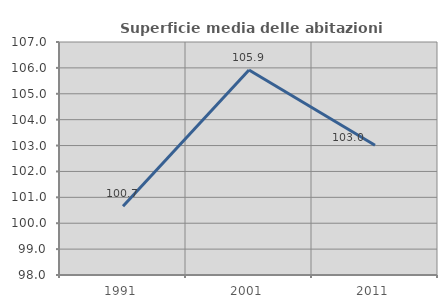
| Category | Superficie media delle abitazioni occupate |
|---|---|
| 1991.0 | 100.653 |
| 2001.0 | 105.916 |
| 2011.0 | 103.01 |